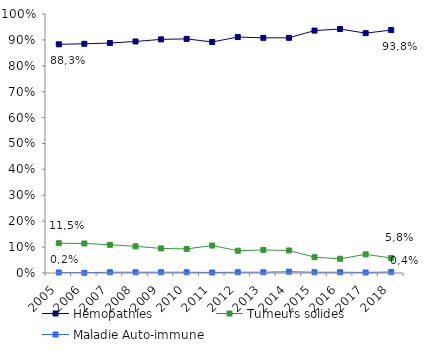
| Category | Hémopathies | Tumeurs solides | Maladie Auto-immune |
|---|---|---|---|
| 2005.0 | 0.883 | 0.115 | 0.002 |
| 2006.0 | 0.885 | 0.114 | 0.001 |
| 2007.0 | 0.888 | 0.109 | 0.003 |
| 2008.0 | 0.894 | 0.103 | 0.003 |
| 2009.0 | 0.902 | 0.095 | 0.003 |
| 2010.0 | 0.904 | 0.093 | 0.003 |
| 2011.0 | 0.892 | 0.106 | 0.002 |
| 2012.0 | 0.911 | 0.086 | 0.003 |
| 2013.0 | 0.908 | 0.089 | 0.003 |
| 2014.0 | 0.908 | 0.087 | 0.005 |
| 2015.0 | 0.936 | 0.061 | 0.003 |
| 2016.0 | 0.942 | 0.055 | 0.003 |
| 2017.0 | 0.926 | 0.072 | 0.002 |
| 2018.0 | 0.938 | 0.058 | 0.004 |